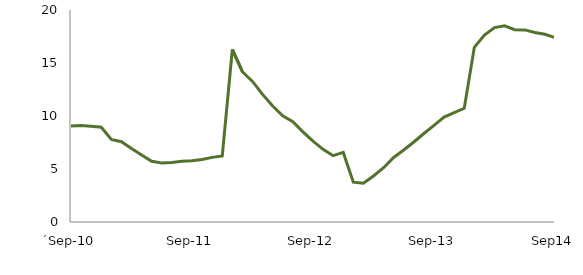
| Category | Series 0 |
|---|---|
| ´Sep-10 | 9.053 |
|  | 9.109 |
|  | 9.032 |
|  | 8.944 |
|  | 7.796 |
|  | 7.572 |
|  | 6.945 |
|  | 6.327 |
|  | 5.732 |
|  | 5.566 |
|  | 5.619 |
|  | 5.739 |
| Sep-11 | 5.777 |
|  | 5.893 |
|  | 6.097 |
|  | 6.236 |
|  | 16.275 |
|  | 14.177 |
|  | 13.262 |
|  | 12.037 |
|  | 10.94 |
|  | 10.022 |
|  | 9.459 |
|  | 8.507 |
| Sep-12 | 7.627 |
|  | 6.858 |
|  | 6.256 |
|  | 6.564 |
|  | 3.761 |
|  | 3.651 |
|  | 4.343 |
|  | 5.123 |
|  | 6.09 |
|  | 6.793 |
|  | 7.549 |
|  | 8.351 |
| Sep-13 | 9.122 |
|  | 9.9 |
|  | 10.325 |
|  | 10.727 |
|  | 16.476 |
|  | 17.627 |
|  | 18.342 |
|  | 18.502 |
|  | 18.146 |
|  | 18.121 |
|  | 17.884 |
|  | 17.705 |
| Sep14 | 17.398 |